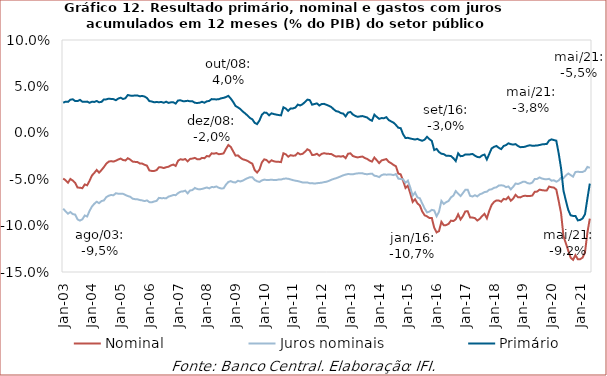
| Category | Nominal | Juros nominais | Primário |
|---|---|---|---|
| 2003-01-01 | -0.049 | -0.082 | 0.032 |
| 2003-02-01 | -0.051 | -0.085 | 0.034 |
| 2003-03-01 | -0.054 | -0.087 | 0.033 |
| 2003-04-01 | -0.05 | -0.085 | 0.036 |
| 2003-05-01 | -0.051 | -0.088 | 0.036 |
| 2003-06-01 | -0.054 | -0.088 | 0.034 |
| 2003-07-01 | -0.059 | -0.093 | 0.034 |
| 2003-08-01 | -0.059 | -0.095 | 0.036 |
| 2003-09-01 | -0.06 | -0.093 | 0.034 |
| 2003-10-01 | -0.056 | -0.089 | 0.033 |
| 2003-11-01 | -0.057 | -0.09 | 0.034 |
| 2003-12-01 | -0.052 | -0.084 | 0.032 |
| 2004-01-01 | -0.046 | -0.079 | 0.033 |
| 2004-02-01 | -0.043 | -0.076 | 0.033 |
| 2004-03-01 | -0.04 | -0.074 | 0.034 |
| 2004-04-01 | -0.043 | -0.076 | 0.033 |
| 2004-05-01 | -0.04 | -0.073 | 0.033 |
| 2004-06-01 | -0.037 | -0.073 | 0.036 |
| 2004-07-01 | -0.033 | -0.069 | 0.036 |
| 2004-08-01 | -0.031 | -0.068 | 0.037 |
| 2004-09-01 | -0.031 | -0.067 | 0.036 |
| 2004-10-01 | -0.031 | -0.067 | 0.036 |
| 2004-11-01 | -0.03 | -0.065 | 0.035 |
| 2004-12-01 | -0.029 | -0.066 | 0.037 |
| 2005-01-01 | -0.028 | -0.066 | 0.038 |
| 2005-02-01 | -0.029 | -0.066 | 0.036 |
| 2005-03-01 | -0.03 | -0.067 | 0.037 |
| 2005-04-01 | -0.027 | -0.068 | 0.041 |
| 2005-05-01 | -0.029 | -0.069 | 0.04 |
| 2005-06-01 | -0.031 | -0.071 | 0.04 |
| 2005-07-01 | -0.031 | -0.072 | 0.04 |
| 2005-08-01 | -0.031 | -0.072 | 0.04 |
| 2005-09-01 | -0.033 | -0.072 | 0.039 |
| 2005-10-01 | -0.033 | -0.073 | 0.04 |
| 2005-11-01 | -0.034 | -0.074 | 0.039 |
| 2005-12-01 | -0.035 | -0.073 | 0.037 |
| 2006-01-01 | -0.041 | -0.075 | 0.034 |
| 2006-02-01 | -0.041 | -0.075 | 0.034 |
| 2006-03-01 | -0.041 | -0.074 | 0.033 |
| 2006-04-01 | -0.04 | -0.073 | 0.033 |
| 2006-05-01 | -0.037 | -0.07 | 0.033 |
| 2006-06-01 | -0.037 | -0.07 | 0.033 |
| 2006-07-01 | -0.038 | -0.07 | 0.032 |
| 2006-08-01 | -0.037 | -0.071 | 0.034 |
| 2006-09-01 | -0.037 | -0.069 | 0.032 |
| 2006-10-01 | -0.035 | -0.068 | 0.033 |
| 2006-11-01 | -0.034 | -0.067 | 0.033 |
| 2006-12-01 | -0.036 | -0.067 | 0.032 |
| 2007-01-01 | -0.03 | -0.065 | 0.035 |
| 2007-02-01 | -0.028 | -0.063 | 0.035 |
| 2007-03-01 | -0.029 | -0.063 | 0.034 |
| 2007-04-01 | -0.028 | -0.062 | 0.034 |
| 2007-05-01 | -0.031 | -0.065 | 0.035 |
| 2007-06-01 | -0.028 | -0.062 | 0.034 |
| 2007-07-01 | -0.028 | -0.062 | 0.034 |
| 2007-08-01 | -0.027 | -0.059 | 0.032 |
| 2007-09-01 | -0.028 | -0.061 | 0.032 |
| 2007-10-01 | -0.029 | -0.061 | 0.032 |
| 2007-11-01 | -0.027 | -0.06 | 0.033 |
| 2007-12-01 | -0.027 | -0.06 | 0.032 |
| 2008-01-01 | -0.025 | -0.059 | 0.034 |
| 2008-02-01 | -0.026 | -0.06 | 0.034 |
| 2008-03-01 | -0.022 | -0.058 | 0.036 |
| 2008-04-01 | -0.022 | -0.059 | 0.036 |
| 2008-05-01 | -0.022 | -0.058 | 0.036 |
| 2008-06-01 | -0.023 | -0.059 | 0.036 |
| 2008-07-01 | -0.023 | -0.06 | 0.037 |
| 2008-08-01 | -0.022 | -0.06 | 0.038 |
| 2008-09-01 | -0.017 | -0.056 | 0.039 |
| 2008-10-01 | -0.013 | -0.053 | 0.04 |
| 2008-11-01 | -0.015 | -0.052 | 0.037 |
| 2008-12-01 | -0.02 | -0.053 | 0.033 |
| 2009-01-01 | -0.025 | -0.054 | 0.029 |
| 2009-02-01 | -0.024 | -0.052 | 0.027 |
| 2009-03-01 | -0.027 | -0.052 | 0.026 |
| 2009-04-01 | -0.029 | -0.052 | 0.023 |
| 2009-05-01 | -0.029 | -0.05 | 0.021 |
| 2009-06-01 | -0.03 | -0.049 | 0.019 |
| 2009-07-01 | -0.032 | -0.048 | 0.016 |
| 2009-08-01 | -0.033 | -0.048 | 0.015 |
| 2009-09-01 | -0.04 | -0.051 | 0.011 |
| 2009-10-01 | -0.043 | -0.052 | 0.009 |
| 2009-11-01 | -0.04 | -0.053 | 0.013 |
| 2009-12-01 | -0.032 | -0.051 | 0.019 |
| 2010-01-01 | -0.029 | -0.05 | 0.022 |
| 2010-02-01 | -0.029 | -0.051 | 0.022 |
| 2010-03-01 | -0.032 | -0.051 | 0.019 |
| 2010-04-01 | -0.03 | -0.051 | 0.021 |
| 2010-05-01 | -0.031 | -0.051 | 0.02 |
| 2010-06-01 | -0.031 | -0.051 | 0.02 |
| 2010-07-01 | -0.031 | -0.05 | 0.019 |
| 2010-08-01 | -0.032 | -0.05 | 0.019 |
| 2010-09-01 | -0.022 | -0.05 | 0.028 |
| 2010-10-01 | -0.023 | -0.049 | 0.026 |
| 2010-11-01 | -0.026 | -0.049 | 0.024 |
| 2010-12-01 | -0.024 | -0.05 | 0.026 |
| 2011-01-01 | -0.025 | -0.051 | 0.026 |
| 2011-02-01 | -0.024 | -0.052 | 0.027 |
| 2011-03-01 | -0.022 | -0.052 | 0.03 |
| 2011-04-01 | -0.023 | -0.053 | 0.029 |
| 2011-05-01 | -0.023 | -0.053 | 0.031 |
| 2011-06-01 | -0.02 | -0.054 | 0.033 |
| 2011-07-01 | -0.018 | -0.054 | 0.036 |
| 2011-08-01 | -0.019 | -0.054 | 0.035 |
| 2011-09-01 | -0.024 | -0.054 | 0.03 |
| 2011-10-01 | -0.024 | -0.055 | 0.031 |
| 2011-11-01 | -0.023 | -0.054 | 0.032 |
| 2011-12-01 | -0.025 | -0.054 | 0.029 |
| 2012-01-01 | -0.023 | -0.054 | 0.031 |
| 2012-02-01 | -0.022 | -0.053 | 0.031 |
| 2012-03-01 | -0.023 | -0.053 | 0.03 |
| 2012-04-01 | -0.023 | -0.052 | 0.029 |
| 2012-05-01 | -0.023 | -0.051 | 0.028 |
| 2012-06-01 | -0.024 | -0.05 | 0.025 |
| 2012-07-01 | -0.026 | -0.049 | 0.023 |
| 2012-08-01 | -0.025 | -0.048 | 0.023 |
| 2012-09-01 | -0.026 | -0.047 | 0.021 |
| 2012-10-01 | -0.025 | -0.046 | 0.021 |
| 2012-11-01 | -0.027 | -0.045 | 0.018 |
| 2012-12-01 | -0.023 | -0.044 | 0.022 |
| 2013-01-01 | -0.022 | -0.045 | 0.022 |
| 2013-02-01 | -0.025 | -0.045 | 0.02 |
| 2013-03-01 | -0.026 | -0.044 | 0.018 |
| 2013-04-01 | -0.027 | -0.044 | 0.017 |
| 2013-05-01 | -0.026 | -0.044 | 0.018 |
| 2013-06-01 | -0.026 | -0.044 | 0.018 |
| 2013-07-01 | -0.027 | -0.044 | 0.017 |
| 2013-08-01 | -0.028 | -0.045 | 0.016 |
| 2013-09-01 | -0.03 | -0.044 | 0.014 |
| 2013-10-01 | -0.031 | -0.044 | 0.013 |
| 2013-11-01 | -0.027 | -0.046 | 0.02 |
| 2013-12-01 | -0.03 | -0.047 | 0.017 |
| 2014-01-01 | -0.033 | -0.048 | 0.015 |
| 2014-02-01 | -0.03 | -0.046 | 0.016 |
| 2014-03-01 | -0.029 | -0.045 | 0.016 |
| 2014-04-01 | -0.028 | -0.045 | 0.017 |
| 2014-05-01 | -0.031 | -0.045 | 0.014 |
| 2014-06-01 | -0.033 | -0.045 | 0.012 |
| 2014-07-01 | -0.035 | -0.046 | 0.011 |
| 2014-08-01 | -0.036 | -0.044 | 0.008 |
| 2014-09-01 | -0.044 | -0.049 | 0.005 |
| 2014-10-01 | -0.045 | -0.05 | 0.005 |
| 2014-11-01 | -0.052 | -0.05 | -0.002 |
| 2014-12-01 | -0.06 | -0.054 | -0.006 |
| 2015-01-01 | -0.057 | -0.052 | -0.005 |
| 2015-02-01 | -0.065 | -0.059 | -0.006 |
| 2015-03-01 | -0.074 | -0.068 | -0.007 |
| 2015-04-01 | -0.072 | -0.064 | -0.007 |
| 2015-05-01 | -0.076 | -0.07 | -0.007 |
| 2015-06-01 | -0.078 | -0.071 | -0.008 |
| 2015-07-01 | -0.085 | -0.076 | -0.009 |
| 2015-08-01 | -0.089 | -0.082 | -0.007 |
| 2015-09-01 | -0.09 | -0.086 | -0.004 |
| 2015-10-01 | -0.092 | -0.085 | -0.007 |
| 2015-11-01 | -0.092 | -0.083 | -0.009 |
| 2015-12-01 | -0.102 | -0.084 | -0.019 |
| 2016-01-01 | -0.107 | -0.09 | -0.017 |
| 2016-02-01 | -0.106 | -0.085 | -0.021 |
| 2016-03-01 | -0.096 | -0.073 | -0.023 |
| 2016-04-01 | -0.1 | -0.077 | -0.023 |
| 2016-05-01 | -0.099 | -0.075 | -0.025 |
| 2016-06-01 | -0.098 | -0.073 | -0.025 |
| 2016-07-01 | -0.095 | -0.07 | -0.025 |
| 2016-08-01 | -0.095 | -0.068 | -0.027 |
| 2016-09-01 | -0.093 | -0.063 | -0.03 |
| 2016-10-01 | -0.088 | -0.066 | -0.022 |
| 2016-11-01 | -0.093 | -0.068 | -0.025 |
| 2016-12-01 | -0.09 | -0.065 | -0.025 |
| 2017-01-01 | -0.085 | -0.061 | -0.023 |
| 2017-02-01 | -0.085 | -0.061 | -0.023 |
| 2017-03-01 | -0.091 | -0.068 | -0.023 |
| 2017-04-01 | -0.091 | -0.069 | -0.023 |
| 2017-05-01 | -0.092 | -0.067 | -0.025 |
| 2017-06-01 | -0.095 | -0.069 | -0.026 |
| 2017-07-01 | -0.093 | -0.066 | -0.026 |
| 2017-08-01 | -0.09 | -0.065 | -0.024 |
| 2017-09-01 | -0.087 | -0.064 | -0.023 |
| 2017-10-01 | -0.092 | -0.063 | -0.029 |
| 2017-11-01 | -0.084 | -0.061 | -0.023 |
| 2017-12-01 | -0.078 | -0.061 | -0.017 |
| 2018-01-01 | -0.074 | -0.059 | -0.015 |
| 2018-02-01 | -0.073 | -0.059 | -0.014 |
| 2018-03-01 | -0.073 | -0.057 | -0.016 |
| 2018-04-01 | -0.074 | -0.057 | -0.018 |
| 2018-05-01 | -0.071 | -0.057 | -0.014 |
| 2018-06-01 | -0.072 | -0.059 | -0.013 |
| 2018-07-01 | -0.069 | -0.058 | -0.011 |
| 2018-08-01 | -0.073 | -0.061 | -0.012 |
| 2018-09-01 | -0.071 | -0.058 | -0.013 |
| 2018-10-01 | -0.067 | -0.055 | -0.012 |
| 2018-11-01 | -0.069 | -0.055 | -0.014 |
| 2018-12-01 | -0.07 | -0.054 | -0.015 |
| 2019-01-01 | -0.068 | -0.053 | -0.015 |
| 2019-02-01 | -0.068 | -0.053 | -0.015 |
| 2019-03-01 | -0.068 | -0.054 | -0.014 |
| 2019-04-01 | -0.068 | -0.055 | -0.013 |
| 2019-05-01 | -0.068 | -0.054 | -0.014 |
| 2019-06-01 | -0.064 | -0.05 | -0.014 |
| 2019-07-01 | -0.063 | -0.05 | -0.014 |
| 2019-08-01 | -0.061 | -0.048 | -0.013 |
| 2019-09-01 | -0.062 | -0.049 | -0.013 |
| 2019-10-01 | -0.062 | -0.05 | -0.012 |
| 2019-11-01 | -0.062 | -0.05 | -0.012 |
| 2019-12-01 | -0.058 | -0.05 | -0.008 |
| 2020-01-01 | -0.059 | -0.052 | -0.007 |
| 2020-02-01 | -0.059 | -0.051 | -0.008 |
| 2020-03-01 | -0.061 | -0.053 | -0.008 |
| 2020-04-01 | -0.073 | -0.051 | -0.022 |
| 2020-05-01 | -0.087 | -0.048 | -0.038 |
| 2020-06-01 | -0.111 | -0.049 | -0.062 |
| 2020-07-01 | -0.119 | -0.046 | -0.073 |
| 2020-08-01 | -0.127 | -0.044 | -0.083 |
| 2020-09-01 | -0.135 | -0.046 | -0.089 |
| 2020-10-01 | -0.137 | -0.047 | -0.09 |
| 2020-11-01 | -0.132 | -0.042 | -0.09 |
| 2020-12-01 | -0.136 | -0.042 | -0.094 |
| 2021-01-01 | -0.136 | -0.042 | -0.094 |
| 2021-02-01 | -0.134 | -0.042 | -0.092 |
| 2021-03-01 | -0.129 | -0.041 | -0.088 |
| 2021-04-01 | -0.108 | -0.037 | -0.071 |
| 2021-05-01 | -0.092 | -0.038 | -0.055 |